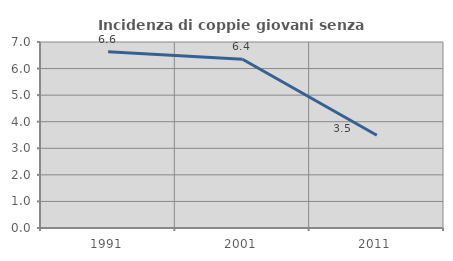
| Category | Incidenza di coppie giovani senza figli |
|---|---|
| 1991.0 | 6.636 |
| 2001.0 | 6.351 |
| 2011.0 | 3.49 |